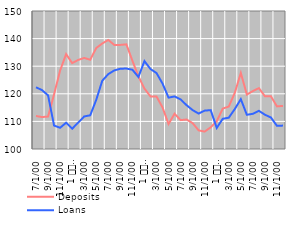
| Category | Deposits | Loans |
|---|---|---|
| 7 | 111.964 | 122.373 |
| 8 | 111.568 | 121.324 |
| 9 | 111.754 | 119.428 |
| 10 | 119.818 | 108.496 |
| 11 | 128.451 | 107.689 |
| 12 | 134.383 | 109.526 |
| 1 
2010 | 131.121 | 107.342 |
| 2 | 132.266 | 109.58 |
| 3 | 132.99 | 111.79 |
| 4 | 132.344 | 112.213 |
| 5 | 136.598 | 117.828 |
| 6 | 138.239 | 124.738 |
| 7 | 139.51 | 127.138 |
| 8 | 137.691 | 128.478 |
| 9 | 137.71 | 129.082 |
| 10 | 137.918 | 129.149 |
| 11 | 131.993 | 128.714 |
| 12 | 126.308 | 126.096 |
| 1 
2011 | 121.901 | 131.847 |
| 2 | 119.046 | 128.989 |
| 3 | 119.035 | 127.523 |
| 4 | 115.079 | 123.723 |
| 5 | 109.057 | 118.616 |
| 6 | 112.781 | 119.041 |
| 7 | 110.467 | 117.972 |
| 8 | 110.68 | 115.863 |
| 9 | 109.37 | 114.087 |
| 10 | 106.749 | 112.84 |
| 11 | 106.316 | 113.908 |
| 12 | 107.862 | 114.083 |
| 1 
2012 | 110.055 | 107.629 |
| 2 | 114.639 | 110.941 |
| 3 | 115.37 | 111.347 |
| 4 | 120.347 | 114.471 |
| 5 | 127.565 | 118.064 |
| 6 | 119.712 | 112.398 |
| 7 | 120.992 | 112.755 |
| 8 | 122.05 | 113.833 |
| 9 | 119.104 | 112.422 |
| 10 | 119.074 | 111.413 |
| 11 | 115.439 | 108.388 |
| 12 | 115.609 | 108.478 |